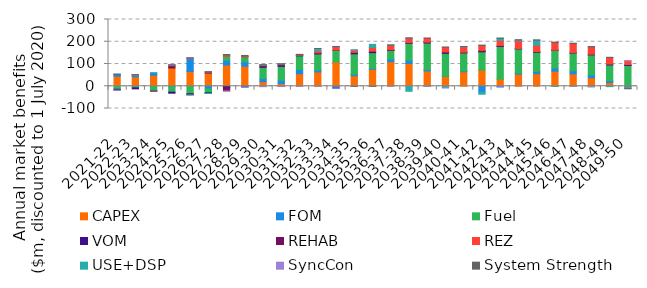
| Category | CAPEX | FOM | Fuel | VOM | REHAB | REZ | USE+DSP | SyncCon | System Strength |
|---|---|---|---|---|---|---|---|---|---|
| 2021-22 | 44.448 | 9.083 | -13.533 | -3.655 | 0 | 0 | 0 | -0.047 | 0.464 |
| 2022-23 | 42.413 | 8.667 | -7.149 | -4.595 | 0 | 0 | 0 | 0.109 | 0.443 |
| 2023-24 | 49.457 | 10.54 | -19.858 | -1.884 | 0 | -0.714 | 0 | -0.084 | -0.072 |
| 2024-25 | 82.225 | -2.57 | -23.929 | -4.769 | 9.93 | 2.473 | 0.166 | 0.567 | 0.951 |
| 2025-26 | 66.23 | 57.999 | -33.833 | -3.193 | -1.716 | 2.14 | -0.006 | 0.477 | 0.897 |
| 2026-27 | 59.399 | -11.779 | -17.88 | -2.91 | 4.236 | -0.036 | -0.018 | 0.786 | 0.787 |
| 2027-28 | 95.069 | 21.289 | 17.704 | -5.607 | -15.266 | 6.47 | 0.024 | -0.865 | 2.125 |
| 2028-29 | 89.94 | 19.878 | 23.052 | -3.097 | 0 | 3.53 | -0.88 | -0.877 | 2.089 |
| 2029-30 | 20.497 | 14.501 | 50.076 | 5.844 | 1.418 | 3.042 | 0.703 | -1.927 | 0.6 |
| 2030-31 | 12.569 | 14.317 | 62.392 | 7.424 | 0 | 2.903 | 0.049 | -1.444 | 0.957 |
| 2031-32 | 56.166 | 19.42 | 61.044 | 2.174 | 0.418 | 2.777 | 0.378 | -1.147 | 0.907 |
| 2032-33 | 64.232 | 9.078 | 71.839 | 5.009 | 0 | 9.728 | 9.673 | -0.123 | 0.15 |
| 2033-34 | 109.099 | -7.517 | 51.776 | -0.316 | 1.502 | 15.131 | 0.202 | -0.18 | 1.127 |
| 2034-35 | 46.936 | 6.414 | 92.508 | 6.248 | 0 | 10.203 | 1.433 | -0.076 | -0.265 |
| 2035-36 | 76.377 | 4.35 | 70.188 | 6.664 | 0 | 16.897 | 13.857 | -0.033 | -0.136 |
| 2036-37 | 110.155 | 11.895 | 38.521 | 3.331 | 0.007 | 20.626 | 0.443 | -0.052 | 0.088 |
| 2037-38 | 102.311 | 13.994 | 76.693 | 2.947 | 0 | 20.057 | -22.601 | 0.151 | 0.805 |
| 2038-39 | 68.572 | 6.462 | 119.288 | 4.107 | 0 | 17.429 | -0.056 | -0.036 | 0.452 |
| 2039-40 | 45.529 | 0.175 | 102.096 | 6.166 | 0 | 21.655 | -6.975 | -0.001 | 0.058 |
| 2040-41 | 65.367 | 3.576 | 80.761 | 2.114 | 1.246 | 24.433 | 0.457 | 0.166 | 0.485 |
| 2041-42 | 72.387 | -26.695 | 82.274 | 2.562 | 3.784 | 22.391 | -9.193 | 0.245 | 0.864 |
| 2042-43 | 31.752 | -2.966 | 146.745 | 3.906 | 0 | 24.271 | 9.168 | -0.06 | 0.368 |
| 2043-44 | 54.073 | 5.148 | 108.457 | 1.845 | 0.208 | 34.234 | 3.373 | 0.22 | 1.298 |
| 2044-45 | 56.331 | 10.193 | 86.163 | 2.912 | 0 | 29.101 | 21.946 | 0.219 | 1.133 |
| 2045-46 | 67.554 | 14.422 | 79.092 | 1.047 | 0 | 34.509 | -0.751 | 0.076 | 1.473 |
| 2046-47 | 55.668 | 14.036 | 79.636 | 2.126 | 0 | 40.573 | -0.33 | -0.044 | 1.408 |
| 2047-48 | 38.109 | 12.676 | 90.134 | 2.843 | -1.686 | 33.407 | -0.145 | -0.02 | 1.034 |
| 2048-49 | 16.757 | 8.907 | 69.999 | 3.714 | 0 | 29.938 | -1.85 | 0.024 | 0.792 |
| 2049-50 | -6.9 | 3.031 | 90.35 | 3.976 | 0 | 16.888 | -3.907 | 0.04 | -0.183 |